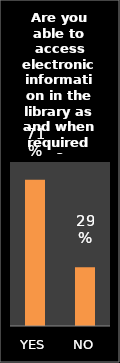
| Category | Series 0 |
|---|---|
| YES | 0.713 |
| NO | 0.287 |